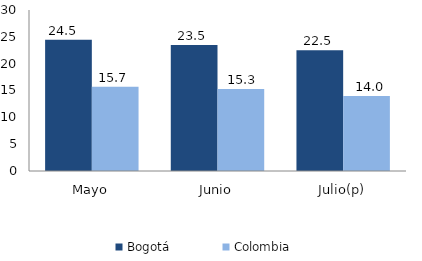
| Category | Bogotá | Colombia |
|---|---|---|
| Mayo | 24.473 | 15.687 |
| Junio | 23.49 | 15.291 |
| Julio(p) | 22.506 | 13.982 |